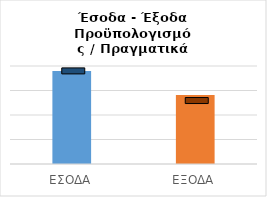
| Category | Series 0 |
|---|---|
| ΕΣΟΔΑ | 1900 |
| ΕΞΟΔΑ | 1409 |